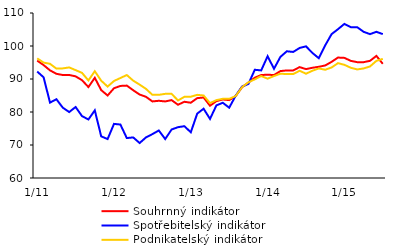
| Category | Souhrnný indikátor | Spotřebitelský indikátor | Podnikatelský indikátor |
|---|---|---|---|
|  1/11 | 95.573 | 92.257 | 96.247 |
| 2 | 94.219 | 90.518 | 94.973 |
| 3 | 92.615 | 82.847 | 94.603 |
| 4 | 91.578 | 83.87 | 93.146 |
| 5 | 91.206 | 81.313 | 93.219 |
| 6 | 91.223 | 79.983 | 93.51 |
| 7 | 90.799 | 81.517 | 92.688 |
| 8 | 89.645 | 78.756 | 91.861 |
| 9 | 87.565 | 77.733 | 89.566 |
| 10 | 90.354 | 80.494 | 92.36 |
| 11 | 86.636 | 72.619 | 89.488 |
| 12 | 85 | 71.8 | 87.7 |
|  1/12 | 87.2 | 76.4 | 89.4 |
| 2 | 87.9 | 76.2 | 90.3 |
| 3 | 88 | 72.1 | 91.2 |
| 4 | 86.6 | 72.3 | 89.5 |
| 5 | 85.3 | 70.6 | 88.3 |
| 6 | 84.6 | 72.3 | 87 |
| 7 | 83.2 | 73.3 | 85.2 |
| 8 | 83.4 | 74.4 | 85.2 |
| 9 | 83.2 | 71.8 | 85.5 |
| 10 | 83.6 | 74.7 | 85.5 |
| 11 | 82.2 | 75.4 | 83.5 |
| 12 | 83.1 | 75.7 | 84.6 |
|  1/13 | 82.809 | 73.846 | 84.633 |
| 2 | 84.2 | 79.5 | 85.2 |
| 3 | 84.4 | 81 | 85 |
| 4 | 81.9 | 77.9 | 82.7 |
| 5 | 83.3 | 82 | 83.6 |
| 6 | 83.8 | 82.8 | 84 |
| 7 | 83.6 | 81.3 | 84 |
| 8 | 84.8 | 84.9 | 84.8 |
| 9 | 87.5 | 87.7 | 87.5 |
| 10 | 88.9 | 88.5 | 89 |
| 11 | 90.4 | 92.8 | 89.9 |
| 12 | 91.2 | 92.6 | 90.9 |
|  1/14 | 91.3 | 96.9 | 90.1 |
|  2 | 91.2 | 93.1 | 90.9 |
| 3 | 92.4 | 96.7 | 91.6 |
| 4 | 92.6 | 98.4 | 91.5 |
| 5 | 92.6 | 98.2 | 91.5 |
| 6 | 93.6 | 99.4 | 92.5 |
| 7 | 93 | 99.9 | 91.6 |
| 8 | 93.4 | 97.9 | 92.5 |
| 9 | 93.7 | 96.3 | 93.2 |
| 10 | 94.1 | 100.2 | 92.8 |
| 11 | 95.2 | 103.6 | 93.5 |
| 12 | 96.5 | 105.1 | 94.8 |
|  1/15 | 96.4 | 106.7 | 94.3 |
| 2 | 95.5 | 105.7 | 93.4 |
| 3 | 95.1 | 105.7 | 92.9 |
| 4 | 95.1 | 104.3 | 93.2 |
| 5 | 95.5 | 103.6 | 93.8 |
| 6 | 97 | 104.3 | 95.5 |
| 7 | 94.6 | 103.6 | 96.1 |